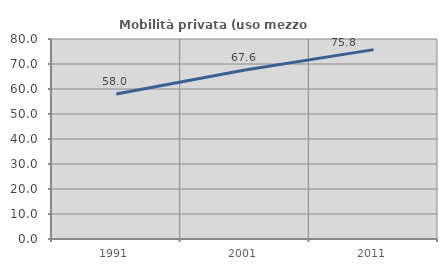
| Category | Mobilità privata (uso mezzo privato) |
|---|---|
| 1991.0 | 58.024 |
| 2001.0 | 67.597 |
| 2011.0 | 75.755 |